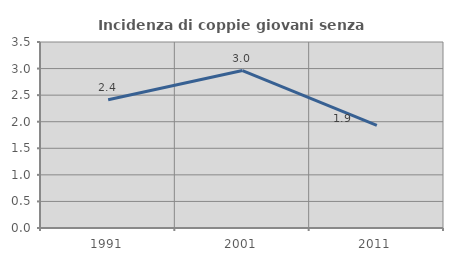
| Category | Incidenza di coppie giovani senza figli |
|---|---|
| 1991.0 | 2.414 |
| 2001.0 | 2.963 |
| 2011.0 | 1.933 |